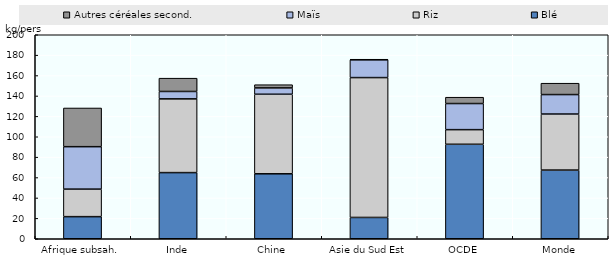
| Category | Blé | Riz | Maïs | Autres céréales second. |
|---|---|---|---|---|
| Afrique subsah. | 21.672 | 26.984 | 41.609 | 37.938 |
| Inde | 64.856 | 72.292 | 7.248 | 13.047 |
| Chine | 63.684 | 77.987 | 6.213 | 3.172 |
| Asie du Sud Est | 20.891 | 137.117 | 17.403 | 0.586 |
| OCDE | 92.626 | 14.341 | 25.59 | 6.222 |
| Monde | 67.337 | 54.939 | 19.071 | 11.164 |